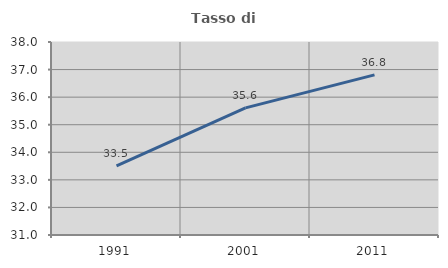
| Category | Tasso di occupazione   |
|---|---|
| 1991.0 | 33.506 |
| 2001.0 | 35.612 |
| 2011.0 | 36.806 |